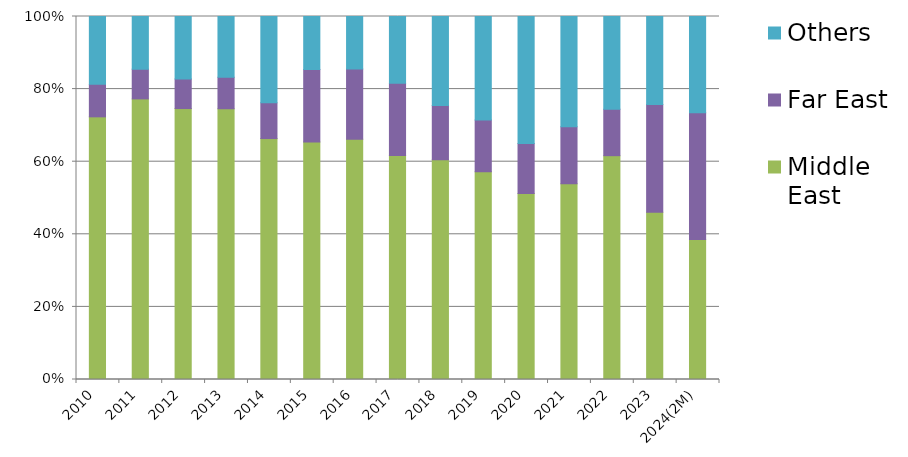
| Category | Middle East | Far East | Others |
|---|---|---|---|
| 2010 | 72.356 | 8.972 | 18.672 |
| 2011 | 77.303 | 8.196 | 14.501 |
| 2012 | 74.639 | 8.156 | 17.205 |
| 2013 | 74.587 | 8.675 | 16.738 |
| 2014 | 66.371 | 9.853 | 23.776 |
| 2015 | 65.421 | 20.003 | 14.576 |
| 2016 | 66.166 | 19.368 | 14.466 |
| 2017 | 61.692 | 19.92 | 18.388 |
| 2018 | 60.547 | 14.918 | 24.534 |
| 2019 | 57.253 | 14.256 | 28.491 |
| 2020 | 51.237 | 13.799 | 34.964 |
| 2021 | 53.932 | 15.709 | 30.359 |
| 2022 | 61.658 | 12.795 | 25.547 |
| 2023 | 46.084 | 29.701 | 24.215 |
| 2024(2M) | 38.573 | 34.936 | 26.491 |